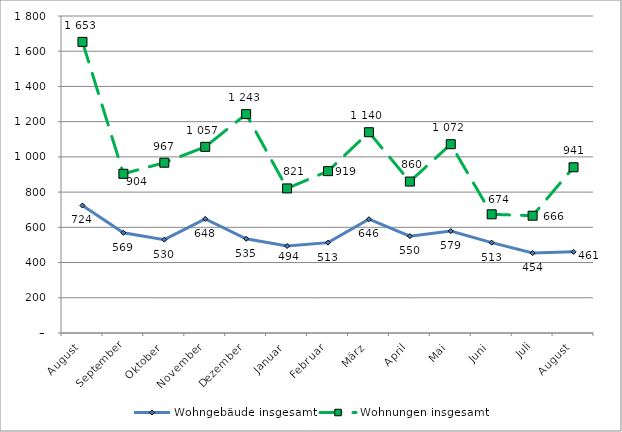
| Category | Wohngebäude insgesamt | Wohnungen insgesamt |
|---|---|---|
| August | 724 | 1653 |
| September | 569 | 904 |
| Oktober | 530 | 967 |
| November | 648 | 1057 |
| Dezember | 535 | 1243 |
| Januar | 494 | 821 |
| Februar | 513 | 919 |
| März | 646 | 1140 |
| April | 550 | 860 |
| Mai | 579 | 1072 |
| Juni | 513 | 674 |
| Juli | 454 | 666 |
| August | 461 | 941 |